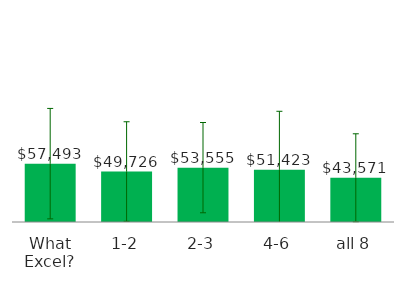
| Category | Total |
|---|---|
| What Excel? | 57493.382 |
| 1-2 | 49726.376 |
| 2-3 | 53554.662 |
| 4-6 | 51423.251 |
| all 8 | 43571.163 |